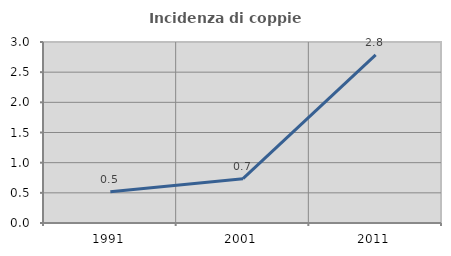
| Category | Incidenza di coppie miste |
|---|---|
| 1991.0 | 0.516 |
| 2001.0 | 0.735 |
| 2011.0 | 2.787 |